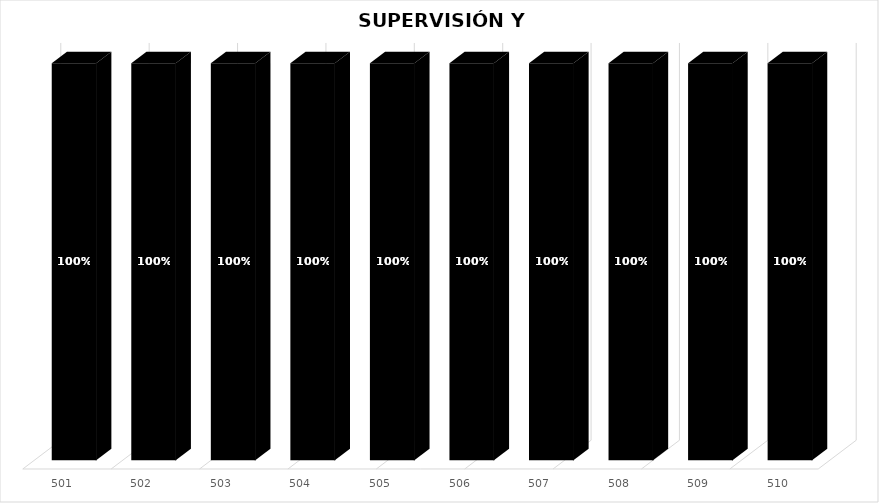
| Category | % Avance |
|---|---|
| 501.0 | 1 |
| 502.0 | 1 |
| 503.0 | 1 |
| 504.0 | 1 |
| 505.0 | 1 |
| 506.0 | 1 |
| 507.0 | 1 |
| 508.0 | 1 |
| 509.0 | 1 |
| 510.0 | 1 |